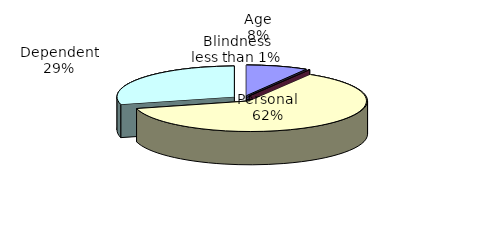
| Category | Series 0 |
|---|---|
| Age | 688999 |
| Blindness | 10010 |
| Personal | 5054834 |
| Dependent | 2353116 |